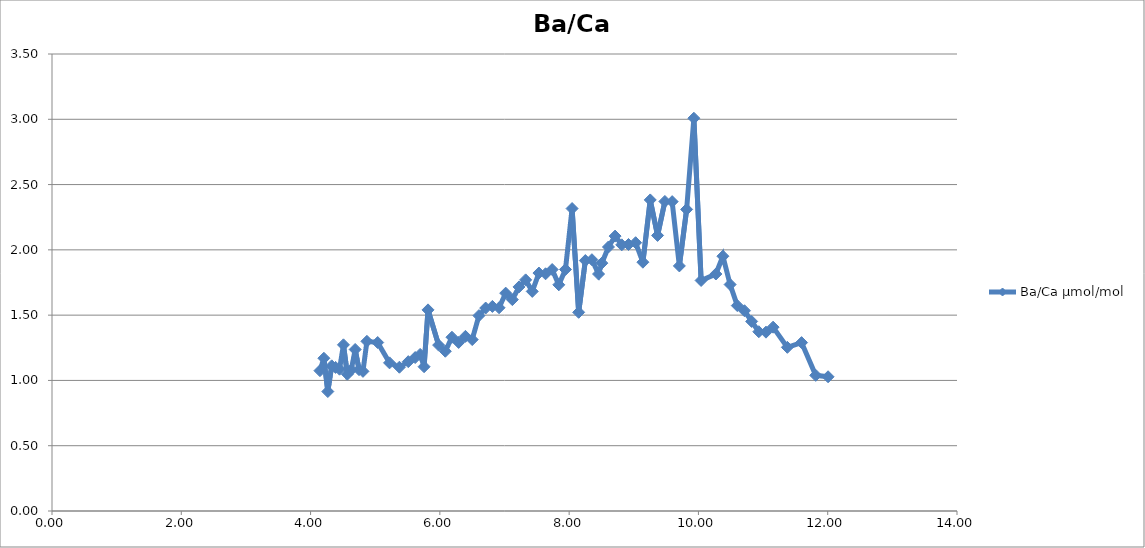
| Category | Ba/Ca µmol/mol |
|---|---|
| 4.145 | 1.075 |
| 4.206 | 1.17 |
| 4.2665 | 0.915 |
| 4.327 | 1.112 |
| 4.3875 | 1.1 |
| 4.448 | 1.086 |
| 4.5085 | 1.273 |
| 4.569 | 1.048 |
| 4.6295 | 1.08 |
| 4.69 | 1.237 |
| 4.75 | 1.082 |
| 4.8105 | 1.069 |
| 4.8715 | 1.299 |
| 5.0385 | 1.29 |
| 5.2215 | 1.135 |
| 5.374 | 1.101 |
| 5.5115 | 1.144 |
| 5.6185 | 1.175 |
| 5.695 | 1.199 |
| 5.756 | 1.105 |
| 5.817 | 1.54 |
| 5.981 | 1.271 |
| 6.084 | 1.224 |
| 6.1875 | 1.331 |
| 6.291 | 1.291 |
| 6.3955 | 1.338 |
| 6.5005 | 1.313 |
| 6.6045 | 1.496 |
| 6.709 | 1.554 |
| 6.8125 | 1.567 |
| 6.9155 | 1.557 |
| 7.0185 | 1.668 |
| 7.1215 | 1.619 |
| 7.2245 | 1.716 |
| 7.327 | 1.77 |
| 7.4295 | 1.682 |
| 7.5325 | 1.822 |
| 7.635 | 1.817 |
| 7.7375 | 1.849 |
| 7.84 | 1.732 |
| 7.943 | 1.85 |
| 8.0455 | 2.316 |
| 8.1475 | 1.522 |
| 8.2505 | 1.918 |
| 8.3525 | 1.925 |
| 8.455 | 1.815 |
| 8.506 | 1.898 |
| 8.6085 | 2.022 |
| 8.711 | 2.105 |
| 8.8135 | 2.038 |
| 8.918 | 2.041 |
| 9.0285 | 2.055 |
| 9.141 | 1.906 |
| 9.2545 | 2.382 |
| 9.368 | 2.111 |
| 9.481 | 2.371 |
| 9.5935 | 2.369 |
| 9.705 | 1.877 |
| 9.8175 | 2.31 |
| 9.9295 | 3.008 |
| 10.0415 | 1.766 |
| 10.27 | 1.815 |
| 10.3785 | 1.951 |
| 10.4905 | 1.734 |
| 10.6015 | 1.573 |
| 10.7125 | 1.534 |
| 10.8235 | 1.452 |
| 10.934 | 1.373 |
| 11.045 | 1.37 |
| 11.155 | 1.408 |
| 11.3755 | 1.253 |
| 11.5955 | 1.29 |
| 11.8145 | 1.039 |
| 12.0055 | 1.028 |